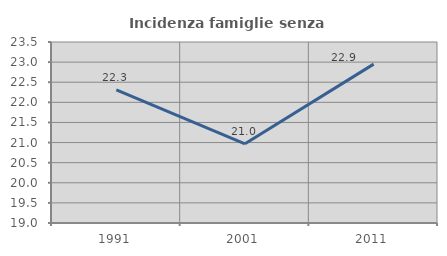
| Category | Incidenza famiglie senza nuclei |
|---|---|
| 1991.0 | 22.311 |
| 2001.0 | 20.969 |
| 2011.0 | 22.95 |